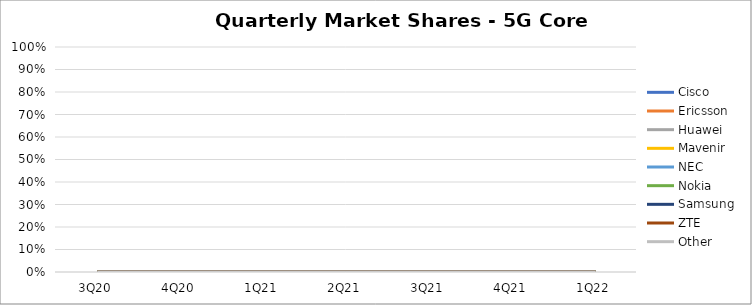
| Category | Cisco | Ericsson | Huawei | Mavenir | NEC | Nokia | Samsung | ZTE | Other |
|---|---|---|---|---|---|---|---|---|---|
| 3Q20 | 0 | 0 | 0 | 0 | 0 | 0 | 0 | 0 | 0 |
| 4Q20 | 0 | 0 | 0 | 0 | 0 | 0 | 0 | 0 | 0 |
| 1Q21 | 0 | 0 | 0 | 0 | 0 | 0 | 0 | 0 | 0 |
| 2Q21 | 0 | 0 | 0 | 0 | 0 | 0 | 0 | 0 | 0 |
| 3Q21 | 0 | 0 | 0 | 0 | 0 | 0 | 0 | 0 | 0 |
| 4Q21 | 0 | 0 | 0 | 0 | 0 | 0 | 0 | 0 | 0 |
| 1Q22 | 0 | 0 | 0 | 0 | 0 | 0 | 0 | 0 | 0 |